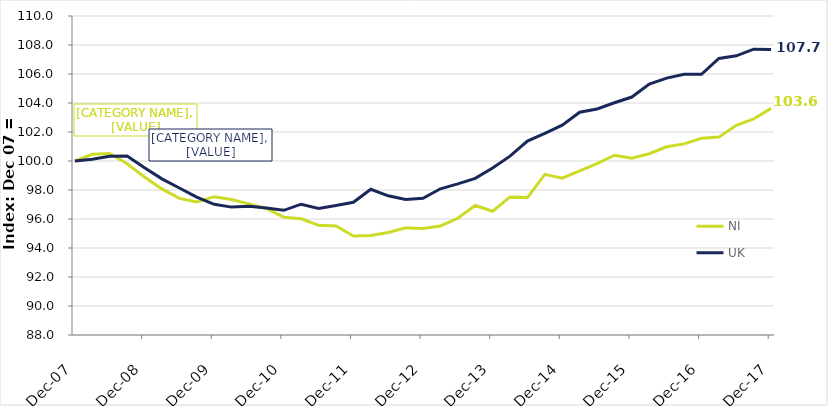
| Category | NI | UK |
|---|---|---|
| 2007-12-01 | 100 | 100 |
| 2008-03-01 | 100.459 | 100.12 |
| 2008-06-01 | 100.52 | 100.322 |
| 2008-09-01 | 99.812 | 100.343 |
| 2008-12-01 | 98.903 | 99.537 |
| 2009-03-01 | 98.077 | 98.769 |
| 2009-06-01 | 97.422 | 98.136 |
| 2009-09-01 | 97.168 | 97.513 |
| 2009-12-01 | 97.54 | 97.014 |
| 2010-03-01 | 97.348 | 96.82 |
| 2010-06-01 | 97.034 | 96.887 |
| 2010-09-01 | 96.723 | 96.752 |
| 2010-12-01 | 96.124 | 96.6 |
| 2011-03-01 | 96.019 | 97.021 |
| 2011-06-01 | 95.565 | 96.731 |
| 2011-09-01 | 95.514 | 96.929 |
| 2011-12-01 | 94.821 | 97.152 |
| 2012-03-01 | 94.866 | 98.051 |
| 2012-06-01 | 95.074 | 97.598 |
| 2012-09-01 | 95.388 | 97.34 |
| 2012-12-01 | 95.345 | 97.428 |
| 2013-03-01 | 95.519 | 98.083 |
| 2013-06-01 | 96.049 | 98.419 |
| 2013-09-01 | 96.928 | 98.804 |
| 2013-12-01 | 96.533 | 99.519 |
| 2014-03-01 | 97.524 | 100.336 |
| 2014-06-01 | 97.476 | 101.373 |
| 2014-09-01 | 99.081 | 101.903 |
| 2014-12-01 | 98.814 | 102.476 |
| 2015-03-01 | 99.313 | 103.361 |
| 2015-06-01 | 99.822 | 103.591 |
| 2015-09-01 | 100.398 | 104.019 |
| 2015-12-01 | 100.198 | 104.412 |
| 2016-03-01 | 100.501 | 105.303 |
| 2016-06-01 | 100.982 | 105.717 |
| 2016-09-01 | 101.181 | 105.975 |
| 2016-12-01 | 101.563 | 105.982 |
| 2017-03-01 | 101.647 | 107.072 |
| 2017-06-01 | 102.466 | 107.256 |
| 2017-09-01 | 102.901 | 107.712 |
| 2017-12-01 | 103.631 | 107.691 |